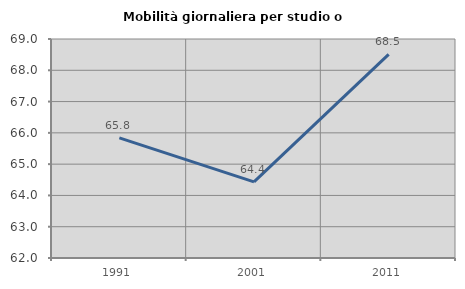
| Category | Mobilità giornaliera per studio o lavoro |
|---|---|
| 1991.0 | 65.841 |
| 2001.0 | 64.434 |
| 2011.0 | 68.511 |